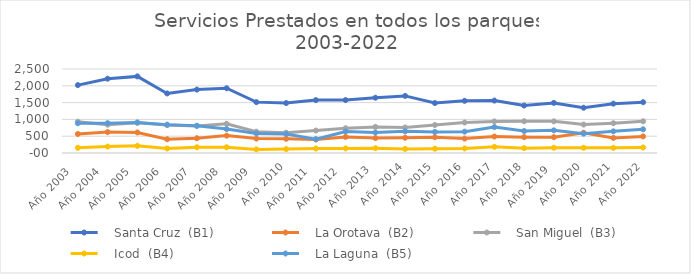
| Category |    Santa Cruz  (B1) |    La Orotava  (B2) |    San Miguel  (B3) |    Icod  (B4) |    La Laguna  (B5) |
|---|---|---|---|---|---|
| Año 2003   | 2021 | 566 | 930 | 156 | 885 |
| Año 2004   | 2212 | 623 | 843 | 191 | 888 |
| Año 2005   | 2280 | 612 | 898 | 213 | 910 |
| Año 2006   | 1773 | 410 | 830 | 134 | 843 |
| Año 2007   | 1887 | 439 | 807 | 171 | 811 |
| Año 2008   | 1927 | 517 | 871 | 171 | 712 |
| Año 2009   | 1514 | 429 | 634 | 106 | 584 |
| Año 2010 | 1487 | 423 | 604 | 116 | 566 |
| Año 2011   | 1574 | 402 | 667 | 133 | 411 |
| Año 2012   | 1574 | 479 | 737 | 136 | 641 |
| Año 2013  | 1645 | 443 | 777 | 142 | 609 |
| Año 2014 | 1699 | 455 | 759 | 121 | 644 |
| Año 2015 | 1486 | 469 | 833 | 128 | 628 |
| Año 2016 | 1553 | 428 | 908 | 136 | 636 |
| Año 2017 | 1561 | 491 | 939 | 184 | 771 |
| Año 2018 | 1412 | 472 | 945 | 145 | 654 |
| Año 2019  | 1491 | 472 | 942 | 156 | 674 |
| Año 2020 | 1347 | 603 | 847 | 156 | 576 |
| Año 2021 | 1469 | 450 | 886 | 153 | 644 |
| Año 2022 | 1512 | 494 | 944 | 164 | 705 |